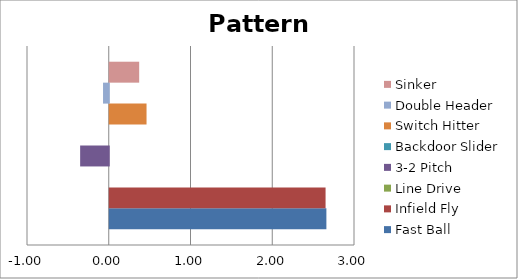
| Category | Fast Ball | Infield Fly | Line Drive | 3-2 Pitch | Backdoor Slider | Switch Hitter | Double Header | Sinker |
|---|---|---|---|---|---|---|---|---|
| 0 | 2.65 | 2.64 | 0 | -0.35 | 0 | 0.45 | -0.07 | 0.36 |